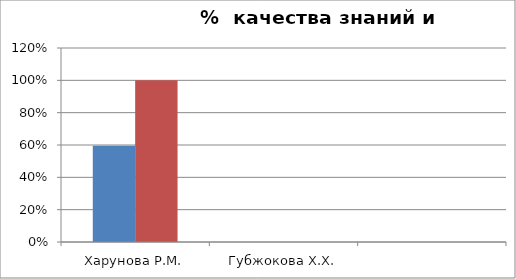
| Category | Series 0 | 2 |
|---|---|---|
| Харунова Р.М. | 0.596 | 1 |
| Губжокова Х.Х. | 0 | 0 |